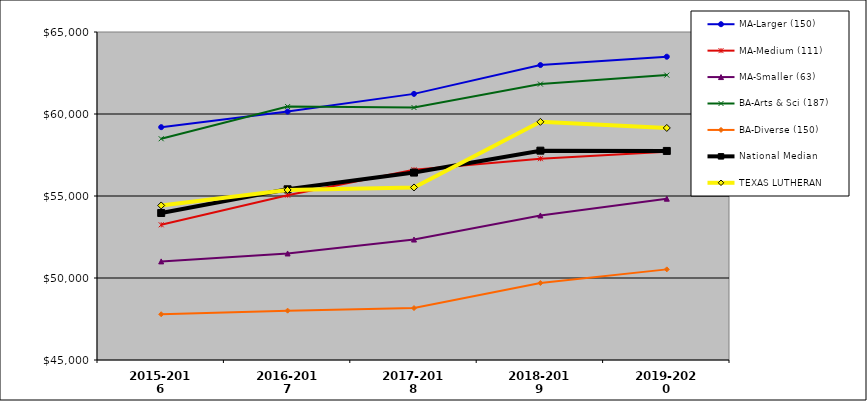
| Category | MA-Larger (150) | MA-Medium (111) | MA-Smaller (63) | BA-Arts & Sci (187) | BA-Diverse (150) | National Median | TEXAS LUTHERAN |
|---|---|---|---|---|---|---|---|
| 2015-2016 | 59197.5 | 53244 | 51012 | 58491 | 47790 | 53964 | 54423 |
| 2016-2017 | 60147 | 55051 | 51496 | 60453 | 48009 | 55410 | 55368 |
| 2017-2018 | 61227.5 | 56600 | 52345 | 60394 | 48166 | 56428 | 55522 |
| 2018-2019 | 62984.5 | 57274 | 53814 | 61826 | 49695.5 | 57764 | 59522 |
| 2019-2020 | 63493 | 57704 | 54836 | 62371 | 50526 | 57747 | 59150 |